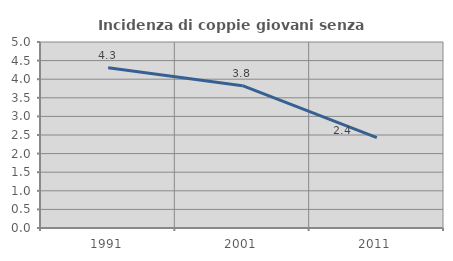
| Category | Incidenza di coppie giovani senza figli |
|---|---|
| 1991.0 | 4.31 |
| 2001.0 | 3.826 |
| 2011.0 | 2.429 |